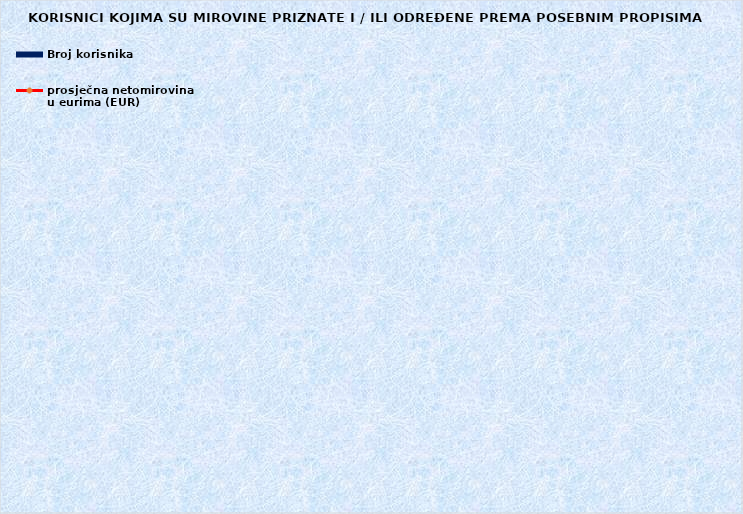
| Category | Broj korisnika |
|---|---|
|      a) radnici na poslovima ovlaštenih službenih osoba u tijelima unutarnjih 
poslova i pravosuđa, kojima je pravo na mirovinu priznato prema propisima
koji su bili na snazi do stupanja na snagu Zakona o pravima iz mirovinskog
osiguranja DVO, PS i OSO | 7021 |
|      b) radnici na  poslovima policijskih službenika, ovlaštenih službenih osoba pravosuđa i službene osobe s posebnim dužnostima i ovlastima u sigurnosno obavještajnom sustavu RH koji su pravo na mirovinu ostvarili prema Zakonu o pravima DVO, PS i OSO | 9495 |
|      c) radnici na poslovima razminiranja | 667 |
| Korisnici koji pravo na mirovinu ostvaruju prema Zakonu o vatrogastvu (NN 125/19)* | 352 |
| Djelatne vojne osobe - DVO  | 16018 |
| Pripadnici Hrvatske domovinske vojske od 1941. do 1945. godine | 1895 |
| Bivši politički zatvorenici | 2071 |
| Hrvatski branitelji iz Domovinskog rata - ZOHBDR | 71286 |
| Mirovine priznate prema općim propisima, a određene prema
ZOHBDR - u iz 2017. (čl. 27., 35., 48. i 49. stavak 2.)  | 57409 |
| Pripadnici bivše Jugoslavenske narodne armije - JNA | 3653 |
| Pripadnici bivše Jugoslavenske narodne armije - JNA - čl. 185 ZOMO | 158 |
| Sudionici Narodnooslobodilačkog rata - NOR | 4950 |
| Zastupnici u Hrvatskom saboru, članovi Vlade, suci Ustavnog suda i glavni državni revizor  | 680 |
| Članovi Izvršnog vijeća Sabora, Saveznog izvršnog vijeća i administrativno umirovljeni javni službenici | 65 |
| Bivši službenici u saveznim tijelima bivše SFRJ - članak 38. ZOMO | 17 |
| Redoviti članovi Hrvatske akademije znanosti i umjetnosti - HAZU | 124 |
| Radnici u Istarskim ugljenokopima "Tupljak" d.d. Labin  | 244 |
| Radnici profesionalno izloženi azbestu | 818 |
| Osiguranici - članovi posade broda u međunarodnoj plovidbi i nacionalnoj plovidbi - članak 129. a stavak 2. Pomorskog zakonika | 203 |
| Pripadnici Hrvatskog vijeća obrane  - HVO  | 6729 |